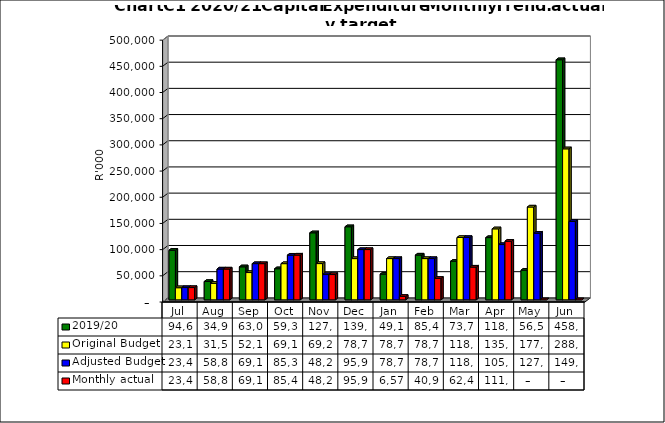
| Category | 2019/20 | Original Budget | Adjusted Budget | Monthly actual |
|---|---|---|---|---|
| Jul | 94661917.305 | 23146604.34 | 23449713.353 | 23449713.35 |
| Aug | 34997120.505 | 31506119.635 | 58840827.869 | 58840827.87 |
| Sep | 63024484.609 | 52101276.725 | 69126894.335 | 69126894.33 |
| Oct | 59349467.812 | 69111701.558 | 85314622.258 | 85425681.67 |
| Nov | 127966561.363 | 69234670.496 | 48292769.82 | 48292769.81 |
| Dec | 139558296.79 | 78739947.961 | 95953914.122 | 95978639.303 |
| Jan | 49120173.272 | 78780743.315 | 78780754.377 | 6570769.858 |
| Feb | 85478228.192 | 78780743.315 | 78780743.315 | 40968693.029 |
| Mar | 73737271.004 | 118994885.383 | 118994902.982 | 62477125.802 |
| Apr | 118845502.652 | 135539662.905 | 105539683.133 | 111884524.236 |
| May | 56523169.68 | 177230590.985 | 127230617.567 | 0 |
| Jun | 458444574.171 | 288331735.384 | 149575587.23 | 0 |